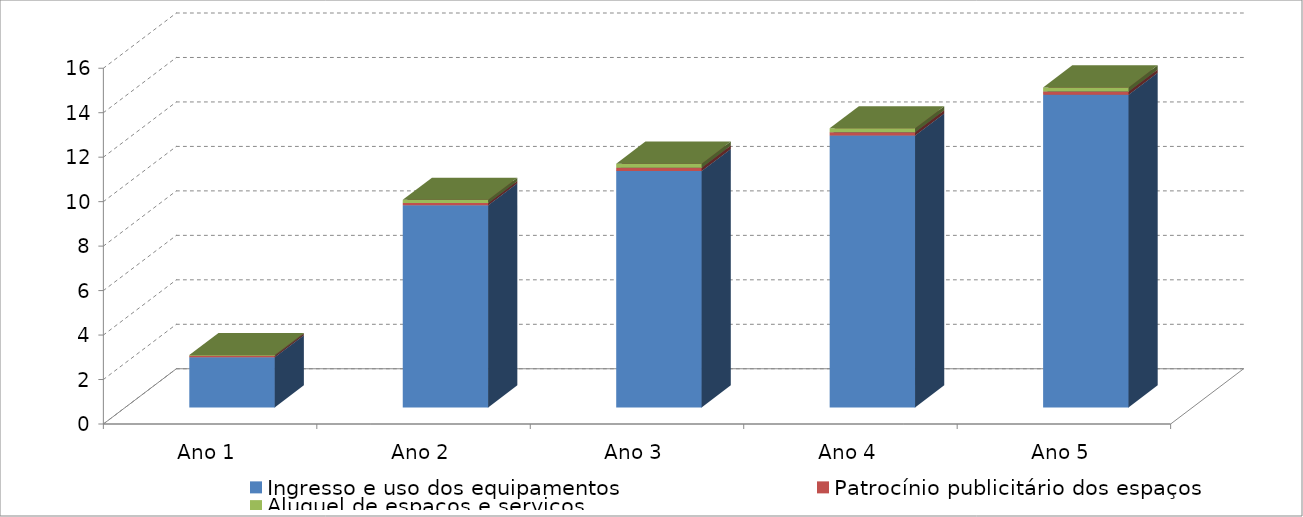
| Category | Ingresso e uso dos equipamentos | Patrocínio publicitário dos espaços | Aluguel de espaços e serviços |
|---|---|---|---|
| Ano 1 | 2252894 | 66000 | 35000 |
| Ano 2 | 9089262 | 100000 | 152000 |
| Ano 3 | 10631329.1 | 150000 | 180000 |
| Ano 4 | 12226028.465 | 150000 | 180000 |
| Ano 5 | 14059932.735 | 150000 | 180000 |